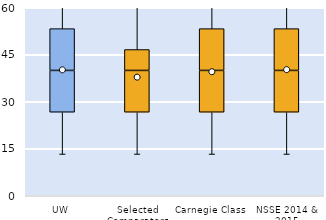
| Category | 25th | 50th | 75th |
|---|---|---|---|
| UW | 26.667 | 13.333 | 13.333 |
| Selected Comparators | 26.667 | 13.333 | 6.667 |
| Carnegie Class | 26.667 | 13.333 | 13.333 |
| NSSE 2014 & 2015 | 26.667 | 13.333 | 13.333 |